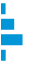
| Category | Series 0 |
|---|---|
| 0 | 0.089 |
| 1 | 0.305 |
| 2 | 0.514 |
| 3 | 0.092 |